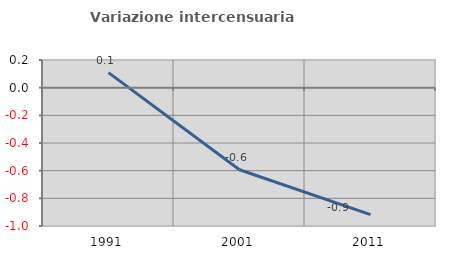
| Category | Variazione intercensuaria annua |
|---|---|
| 1991.0 | 0.109 |
| 2001.0 | -0.593 |
| 2011.0 | -0.918 |